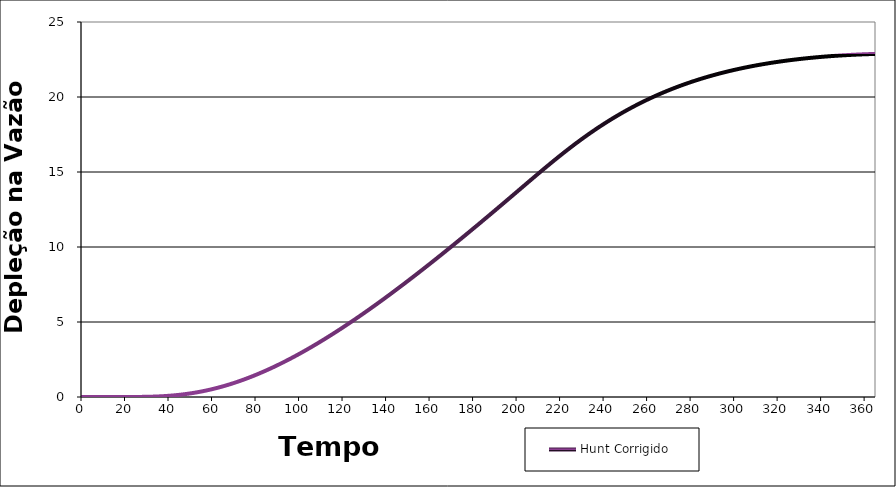
| Category | Hunt Corrigido |
|---|---|
| 0.0 | 0 |
| 1.0 | 0 |
| 2.0 | 0 |
| 3.0 | 0 |
| 4.0 | 0 |
| 5.0 | 0 |
| 6.0 | 0 |
| 7.0 | 0 |
| 8.0 | 0 |
| 9.0 | 0 |
| 10.0 | 0 |
| 11.0 | 0 |
| 12.0 | 0 |
| 13.0 | 0 |
| 14.0 | 0 |
| 15.0 | 0 |
| 16.0 | 0 |
| 17.0 | 0 |
| 18.0 | 0 |
| 19.0 | 0 |
| 20.0 | 0 |
| 21.0 | 0.001 |
| 22.0 | 0.001 |
| 23.0 | 0.002 |
| 24.0 | 0.002 |
| 25.0 | 0.003 |
| 26.0 | 0.005 |
| 27.0 | 0.006 |
| 28.0 | 0.008 |
| 29.0 | 0.01 |
| 30.0 | 0.013 |
| 31.0 | 0.016 |
| 32.0 | 0.02 |
| 33.0 | 0.024 |
| 34.0 | 0.03 |
| 35.0 | 0.035 |
| 36.0 | 0.042 |
| 37.0 | 0.049 |
| 38.0 | 0.057 |
| 39.0 | 0.067 |
| 40.0 | 0.077 |
| 41.0 | 0.087 |
| 42.0 | 0.099 |
| 43.0 | 0.112 |
| 44.0 | 0.126 |
| 45.0 | 0.142 |
| 46.0 | 0.158 |
| 47.0 | 0.175 |
| 48.0 | 0.194 |
| 49.0 | 0.214 |
| 50.0 | 0.235 |
| 51.0 | 0.257 |
| 52.0 | 0.28 |
| 53.0 | 0.305 |
| 54.0 | 0.331 |
| 55.0 | 0.358 |
| 56.0 | 0.387 |
| 57.0 | 0.416 |
| 58.0 | 0.447 |
| 59.0 | 0.48 |
| 60.0 | 0.513 |
| 61.0 | 0.548 |
| 62.0 | 0.584 |
| 63.0 | 0.622 |
| 64.0 | 0.661 |
| 65.0 | 0.701 |
| 66.0 | 0.742 |
| 67.0 | 0.785 |
| 68.0 | 0.829 |
| 69.0 | 0.874 |
| 70.0 | 0.92 |
| 71.0 | 0.968 |
| 72.0 | 1.017 |
| 73.0 | 1.067 |
| 74.0 | 1.119 |
| 75.0 | 1.171 |
| 76.0 | 1.225 |
| 77.0 | 1.28 |
| 78.0 | 1.336 |
| 79.0 | 1.394 |
| 80.0 | 1.452 |
| 81.0 | 1.512 |
| 82.0 | 1.573 |
| 83.0 | 1.635 |
| 84.0 | 1.698 |
| 85.0 | 1.762 |
| 86.0 | 1.827 |
| 87.0 | 1.893 |
| 88.0 | 1.961 |
| 89.0 | 2.029 |
| 90.0 | 2.099 |
| 91.0 | 2.169 |
| 92.0 | 2.241 |
| 93.0 | 2.313 |
| 94.0 | 2.387 |
| 95.0 | 2.461 |
| 96.0 | 2.537 |
| 97.0 | 2.613 |
| 98.0 | 2.69 |
| 99.0 | 2.768 |
| 100.0 | 2.847 |
| 101.0 | 2.928 |
| 102.0 | 3.008 |
| 103.0 | 3.09 |
| 104.0 | 3.173 |
| 105.0 | 3.256 |
| 106.0 | 3.341 |
| 107.0 | 3.426 |
| 108.0 | 3.512 |
| 109.0 | 3.598 |
| 110.0 | 3.686 |
| 111.0 | 3.774 |
| 112.0 | 3.863 |
| 113.0 | 3.953 |
| 114.0 | 4.044 |
| 115.0 | 4.135 |
| 116.0 | 4.227 |
| 117.0 | 4.32 |
| 118.0 | 4.413 |
| 119.0 | 4.507 |
| 120.0 | 4.602 |
| 121.0 | 4.697 |
| 122.0 | 4.793 |
| 123.0 | 4.89 |
| 124.0 | 4.987 |
| 125.0 | 5.085 |
| 126.0 | 5.184 |
| 127.0 | 5.283 |
| 128.0 | 5.383 |
| 129.0 | 5.483 |
| 130.0 | 5.584 |
| 131.0 | 5.686 |
| 132.0 | 5.788 |
| 133.0 | 5.89 |
| 134.0 | 5.993 |
| 135.0 | 6.097 |
| 136.0 | 6.201 |
| 137.0 | 6.306 |
| 138.0 | 6.411 |
| 139.0 | 6.517 |
| 140.0 | 6.623 |
| 141.0 | 6.73 |
| 142.0 | 6.837 |
| 143.0 | 6.944 |
| 144.0 | 7.052 |
| 145.0 | 7.161 |
| 146.0 | 7.27 |
| 147.0 | 7.379 |
| 148.0 | 7.489 |
| 149.0 | 7.599 |
| 150.0 | 7.71 |
| 151.0 | 7.821 |
| 152.0 | 7.932 |
| 153.0 | 8.044 |
| 154.0 | 8.156 |
| 155.0 | 8.269 |
| 156.0 | 8.382 |
| 157.0 | 8.495 |
| 158.0 | 8.609 |
| 159.0 | 8.723 |
| 160.0 | 8.837 |
| 161.0 | 8.952 |
| 162.0 | 9.067 |
| 163.0 | 9.182 |
| 164.0 | 9.298 |
| 165.0 | 9.414 |
| 166.0 | 9.53 |
| 167.0 | 9.646 |
| 168.0 | 9.763 |
| 169.0 | 9.88 |
| 170.0 | 9.998 |
| 171.0 | 10.116 |
| 172.0 | 10.234 |
| 173.0 | 10.352 |
| 174.0 | 10.471 |
| 175.0 | 10.589 |
| 176.0 | 10.708 |
| 177.0 | 10.828 |
| 178.0 | 10.947 |
| 179.0 | 11.067 |
| 180.0 | 11.187 |
| 181.0 | 11.307 |
| 182.0 | 11.428 |
| 183.0 | 11.549 |
| 184.0 | 11.67 |
| 185.0 | 11.791 |
| 186.0 | 11.912 |
| 187.0 | 12.034 |
| 188.0 | 12.156 |
| 189.0 | 12.278 |
| 190.0 | 12.4 |
| 191.0 | 12.522 |
| 192.0 | 12.645 |
| 193.0 | 12.767 |
| 194.0 | 12.89 |
| 195.0 | 13.014 |
| 196.0 | 13.137 |
| 197.0 | 13.26 |
| 198.0 | 13.384 |
| 199.0 | 13.507 |
| 200.0 | 13.631 |
| 201.0 | 13.755 |
| 202.0 | 13.879 |
| 203.0 | 14.003 |
| 204.0 | 14.126 |
| 205.0 | 14.25 |
| 206.0 | 14.374 |
| 207.0 | 14.497 |
| 208.0 | 14.62 |
| 209.0 | 14.743 |
| 210.0 | 14.866 |
| 211.0 | 14.988 |
| 212.0 | 15.11 |
| 213.0 | 15.231 |
| 214.0 | 15.352 |
| 215.0 | 15.472 |
| 216.0 | 15.591 |
| 217.0 | 15.71 |
| 218.0 | 15.828 |
| 219.0 | 15.945 |
| 220.0 | 16.062 |
| 221.0 | 16.177 |
| 222.0 | 16.292 |
| 223.0 | 16.406 |
| 224.0 | 16.519 |
| 225.0 | 16.63 |
| 226.0 | 16.741 |
| 227.0 | 16.851 |
| 228.0 | 16.959 |
| 229.0 | 17.067 |
| 230.0 | 17.173 |
| 231.0 | 17.278 |
| 232.0 | 17.382 |
| 233.0 | 17.485 |
| 234.0 | 17.587 |
| 235.0 | 17.687 |
| 236.0 | 17.786 |
| 237.0 | 17.884 |
| 238.0 | 17.981 |
| 239.0 | 18.076 |
| 240.0 | 18.171 |
| 241.0 | 18.264 |
| 242.0 | 18.356 |
| 243.0 | 18.446 |
| 244.0 | 18.535 |
| 245.0 | 18.623 |
| 246.0 | 18.71 |
| 247.0 | 18.796 |
| 248.0 | 18.88 |
| 249.0 | 18.963 |
| 250.0 | 19.045 |
| 251.0 | 19.126 |
| 252.0 | 19.205 |
| 253.0 | 19.284 |
| 254.0 | 19.361 |
| 255.0 | 19.437 |
| 256.0 | 19.511 |
| 257.0 | 19.585 |
| 258.0 | 19.657 |
| 259.0 | 19.728 |
| 260.0 | 19.799 |
| 261.0 | 19.868 |
| 262.0 | 19.935 |
| 263.0 | 20.002 |
| 264.0 | 20.068 |
| 265.0 | 20.132 |
| 266.0 | 20.196 |
| 267.0 | 20.258 |
| 268.0 | 20.32 |
| 269.0 | 20.38 |
| 270.0 | 20.439 |
| 271.0 | 20.497 |
| 272.0 | 20.555 |
| 273.0 | 20.611 |
| 274.0 | 20.666 |
| 275.0 | 20.721 |
| 276.0 | 20.774 |
| 277.0 | 20.826 |
| 278.0 | 20.878 |
| 279.0 | 20.928 |
| 280.0 | 20.978 |
| 281.0 | 21.027 |
| 282.0 | 21.075 |
| 283.0 | 21.121 |
| 284.0 | 21.168 |
| 285.0 | 21.213 |
| 286.0 | 21.257 |
| 287.0 | 21.301 |
| 288.0 | 21.343 |
| 289.0 | 21.385 |
| 290.0 | 21.427 |
| 291.0 | 21.467 |
| 292.0 | 21.506 |
| 293.0 | 21.545 |
| 294.0 | 21.583 |
| 295.0 | 21.621 |
| 296.0 | 21.657 |
| 297.0 | 21.693 |
| 298.0 | 21.728 |
| 299.0 | 21.762 |
| 300.0 | 21.796 |
| 301.0 | 21.829 |
| 302.0 | 21.861 |
| 303.0 | 21.893 |
| 304.0 | 21.924 |
| 305.0 | 21.954 |
| 306.0 | 21.984 |
| 307.0 | 22.013 |
| 308.0 | 22.042 |
| 309.0 | 22.069 |
| 310.0 | 22.097 |
| 311.0 | 22.123 |
| 312.0 | 22.149 |
| 313.0 | 22.175 |
| 314.0 | 22.2 |
| 315.0 | 22.224 |
| 316.0 | 22.248 |
| 317.0 | 22.271 |
| 318.0 | 22.294 |
| 319.0 | 22.316 |
| 320.0 | 22.337 |
| 321.0 | 22.359 |
| 322.0 | 22.379 |
| 323.0 | 22.399 |
| 324.0 | 22.419 |
| 325.0 | 22.438 |
| 326.0 | 22.457 |
| 327.0 | 22.475 |
| 328.0 | 22.492 |
| 329.0 | 22.51 |
| 330.0 | 22.526 |
| 331.0 | 22.543 |
| 332.0 | 22.559 |
| 333.0 | 22.574 |
| 334.0 | 22.589 |
| 335.0 | 22.604 |
| 336.0 | 22.618 |
| 337.0 | 22.632 |
| 338.0 | 22.645 |
| 339.0 | 22.658 |
| 340.0 | 22.67 |
| 341.0 | 22.683 |
| 342.0 | 22.694 |
| 343.0 | 22.706 |
| 344.0 | 22.717 |
| 345.0 | 22.728 |
| 346.0 | 22.738 |
| 347.0 | 22.748 |
| 348.0 | 22.757 |
| 349.0 | 22.767 |
| 350.0 | 22.776 |
| 351.0 | 22.784 |
| 352.0 | 22.793 |
| 353.0 | 22.8 |
| 354.0 | 22.808 |
| 355.0 | 22.815 |
| 356.0 | 22.822 |
| 357.0 | 22.829 |
| 358.0 | 22.835 |
| 359.0 | 22.841 |
| 360.0 | 22.847 |
| 361.0 | 22.853 |
| 362.0 | 22.858 |
| 363.0 | 22.863 |
| 364.0 | 22.868 |
| 365.0 | 22.872 |